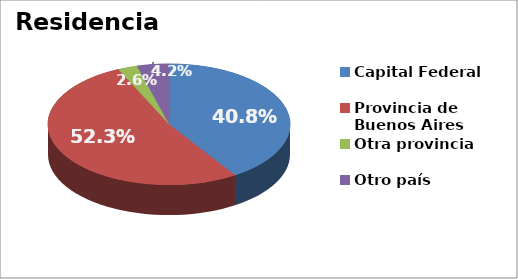
| Category | Series 0 |
|---|---|
| Capital Federal | 0.408 |
| Provincia de Buenos Aires | 0.523 |
| Otra provincia | 0.026 |
| Otro país | 0.042 |